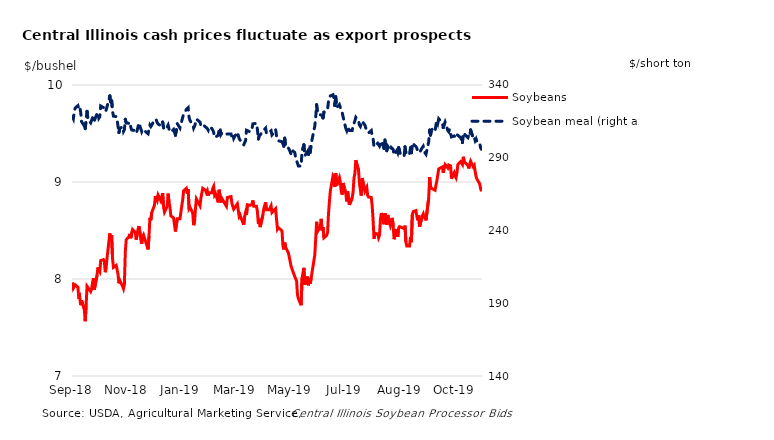
| Category | Soybeans |
|---|---|
| 2018-09-04 | 7.965 |
| 2018-09-05 | 7.905 |
| 2018-09-06 | 7.915 |
| 2018-09-07 | 7.94 |
| 2018-09-10 | 7.915 |
| 2018-09-11 | 7.795 |
| 2018-09-12 | 7.815 |
| 2018-09-13 | 7.73 |
| 2018-09-14 | 7.78 |
| 2018-09-17 | 7.69 |
| 2018-09-18 | 7.565 |
| 2018-09-19 | 7.725 |
| 2018-09-20 | 7.925 |
| 2018-09-21 | 7.93 |
| 2018-09-24 | 7.87 |
| 2018-09-25 | 7.895 |
| 2018-09-26 | 7.96 |
| 2018-09-27 | 8.01 |
| 2018-09-28 | 7.89 |
| 2018-10-01 | 8.04 |
| 2018-10-02 | 8.12 |
| 2018-10-03 | 8.09 |
| 2018-10-04 | 8.075 |
| 2018-10-05 | 8.19 |
| 2018-10-08 | 8.2 |
| 2018-10-09 | 8.18 |
| 2018-10-10 | 8.07 |
| 2018-10-11 | 8.12 |
| 2018-10-12 | 8.22 |
| 2018-10-15 | 8.47 |
| 2018-10-16 | 8.415 |
| 2018-10-17 | 8.45 |
| 2018-10-18 | 8.21 |
| 2018-10-19 | 8.12 |
| 2018-10-22 | 8.14 |
| 2018-10-23 | 8.13 |
| 2018-10-24 | 8.05 |
| 2018-10-25 | 7.955 |
| 2018-10-26 | 7.985 |
| 2018-10-29 | 7.925 |
| 2018-10-30 | 7.9 |
| 2018-10-31 | 7.945 |
| 2018-11-01 | 8.28 |
| 2018-11-02 | 8.405 |
| 2018-11-05 | 8.435 |
| 2018-11-06 | 8.465 |
| 2018-11-07 | 8.42 |
| 2018-11-08 | 8.415 |
| 2018-11-09 | 8.51 |
| 2018-11-12 | 8.48 |
| 2018-11-13 | 8.405 |
| 2018-11-14 | 8.46 |
| 2018-11-15 | 8.515 |
| 2018-11-16 | 8.545 |
| 2018-11-19 | 8.365 |
| 2018-11-20 | 8.435 |
| 2018-11-21 | 8.455 |
| 2018-11-26 | 8.305 |
| 2018-11-27 | 8.44 |
| 2018-11-28 | 8.63 |
| 2018-11-29 | 8.605 |
| 2018-11-30 | 8.685 |
| 2018-12-03 | 8.76 |
| 2018-12-04 | 8.855 |
| 2018-12-05 | 8.85 |
| 2018-12-06 | 8.81 |
| 2018-12-07 | 8.865 |
| 2018-12-10 | 8.805 |
| 2018-12-11 | 8.845 |
| 2018-12-12 | 8.885 |
| 2018-12-13 | 8.745 |
| 2018-12-14 | 8.69 |
| 2018-12-17 | 8.75 |
| 2018-12-18 | 8.88 |
| 2018-12-19 | 8.79 |
| 2018-12-20 | 8.74 |
| 2018-12-21 | 8.65 |
| 2018-12-24 | 8.63 |
| 2018-12-26 | 8.49 |
| 2018-12-27 | 8.48 |
| 2018-12-28 | 8.62 |
| 2018-12-31 | 8.62 |
| 2019-01-02 | 8.755 |
| 2019-01-03 | 8.815 |
| 2019-01-04 | 8.91 |
| 2019-01-07 | 8.935 |
| 2019-01-08 | 8.88 |
| 2019-01-09 | 8.925 |
| 2019-01-10 | 8.725 |
| 2019-01-11 | 8.74 |
| 2019-01-14 | 8.68 |
| 2019-01-15 | 8.555 |
| 2019-01-16 | 8.59 |
| 2019-01-17 | 8.725 |
| 2019-01-18 | 8.825 |
| 2019-01-22 | 8.755 |
| 2019-01-23 | 8.835 |
| 2019-01-24 | 8.845 |
| 2019-01-25 | 8.935 |
| 2019-01-28 | 8.915 |
| 2019-01-29 | 8.89 |
| 2019-01-30 | 8.91 |
| 2019-01-31 | 8.86 |
| 2019-02-01 | 8.89 |
| 2019-02-04 | 8.89 |
| 2019-02-05 | 8.935 |
| 2019-02-06 | 8.955 |
| 2019-02-07 | 8.865 |
| 2019-02-08 | 8.88 |
| 2019-02-11 | 8.79 |
| 2019-02-12 | 8.92 |
| 2019-02-13 | 8.92 |
| 2019-02-14 | 8.79 |
| 2019-02-15 | 8.83 |
| 2019-02-19 | 8.765 |
| 2019-02-20 | 8.75 |
| 2019-02-21 | 8.84 |
| 2019-02-22 | 8.83 |
| 2019-02-25 | 8.85 |
| 2019-02-26 | 8.78 |
| 2019-02-27 | 8.78 |
| 2019-02-28 | 8.72 |
| 2019-03-01 | 8.73 |
| 2019-03-04 | 8.775 |
| 2019-03-05 | 8.765 |
| 2019-03-06 | 8.645 |
| 2019-03-07 | 8.66 |
| 2019-03-08 | 8.63 |
| 2019-03-11 | 8.56 |
| 2019-03-12 | 8.645 |
| 2019-03-13 | 8.685 |
| 2019-03-14 | 8.66 |
| 2019-03-15 | 8.765 |
| 2019-03-18 | 8.76 |
| 2019-03-19 | 8.75 |
| 2019-03-20 | 8.77 |
| 2019-03-21 | 8.81 |
| 2019-03-22 | 8.75 |
| 2019-03-25 | 8.75 |
| 2019-03-26 | 8.695 |
| 2019-03-27 | 8.57 |
| 2019-03-28 | 8.59 |
| 2019-03-29 | 8.535 |
| 2019-04-01 | 8.66 |
| 2019-04-02 | 8.725 |
| 2019-04-03 | 8.715 |
| 2019-04-04 | 8.79 |
| 2019-04-05 | 8.715 |
| 2019-04-08 | 8.715 |
| 2019-04-09 | 8.725 |
| 2019-04-10 | 8.755 |
| 2019-04-11 | 8.685 |
| 2019-04-12 | 8.685 |
| 2019-04-15 | 8.725 |
| 2019-04-16 | 8.615 |
| 2019-04-17 | 8.515 |
| 2019-04-18 | 8.53 |
| 2019-04-22 | 8.495 |
| 2019-04-23 | 8.345 |
| 2019-04-24 | 8.305 |
| 2019-04-25 | 8.375 |
| 2019-04-26 | 8.325 |
| 2019-04-29 | 8.27 |
| 2019-04-30 | 8.225 |
| 2019-05-01 | 8.22 |
| 2019-05-02 | 8.13 |
| 2019-05-03 | 8.135 |
| 2019-05-06 | 8.025 |
| 2019-05-07 | 8.025 |
| 2019-05-08 | 7.98 |
| 2019-05-09 | 7.835 |
| 2019-05-10 | 7.795 |
| 2019-05-13 | 7.73 |
| 2019-05-14 | 8.01 |
| 2019-05-15 | 8.06 |
| 2019-05-16 | 8.115 |
| 2019-05-17 | 7.94 |
| 2019-05-20 | 8.025 |
| 2019-05-21 | 7.935 |
| 2019-05-22 | 8.01 |
| 2019-05-23 | 7.95 |
| 2019-05-24 | 8.01 |
| 2019-05-28 | 8.25 |
| 2019-05-29 | 8.42 |
| 2019-05-30 | 8.59 |
| 2019-05-31 | 8.49 |
| 2019-06-03 | 8.54 |
| 2019-06-04 | 8.62 |
| 2019-06-05 | 8.5 |
| 2019-06-06 | 8.535 |
| 2019-06-07 | 8.425 |
| 2019-06-10 | 8.45 |
| 2019-06-11 | 8.48 |
| 2019-06-12 | 8.67 |
| 2019-06-13 | 8.795 |
| 2019-06-14 | 8.905 |
| 2019-06-17 | 9.065 |
| 2019-06-18 | 9.05 |
| 2019-06-19 | 8.95 |
| 2019-06-20 | 9.09 |
| 2019-06-21 | 8.965 |
| 2019-06-24 | 9.045 |
| 2019-06-25 | 9 |
| 2019-06-26 | 8.905 |
| 2019-06-27 | 8.87 |
| 2019-06-28 | 8.99 |
| 2019-07-01 | 8.885 |
| 2019-07-02 | 8.8 |
| 2019-07-03 | 8.905 |
| 2019-07-05 | 8.765 |
| 2019-07-08 | 8.835 |
| 2019-07-09 | 8.895 |
| 2019-07-10 | 9.04 |
| 2019-07-11 | 9.09 |
| 2019-07-12 | 9.225 |
| 2019-07-15 | 9.12 |
| 2019-07-16 | 8.985 |
| 2019-07-17 | 8.92 |
| 2019-07-18 | 8.86 |
| 2019-07-19 | 9.04 |
| 2019-07-22 | 8.905 |
| 2019-07-23 | 8.895 |
| 2019-07-24 | 8.945 |
| 2019-07-25 | 8.86 |
| 2019-07-26 | 8.845 |
| 2019-07-29 | 8.84 |
| 2019-07-30 | 8.75 |
| 2019-07-31 | 8.6 |
| 2019-08-01 | 8.415 |
| 2019-08-02 | 8.47 |
| 2019-08-05 | 8.465 |
| 2019-08-06 | 8.425 |
| 2019-08-07 | 8.45 |
| 2019-08-08 | 8.61 |
| 2019-08-09 | 8.68 |
| 2019-08-12 | 8.565 |
| 2019-08-13 | 8.68 |
| 2019-08-14 | 8.59 |
| 2019-08-15 | 8.56 |
| 2019-08-16 | 8.66 |
| 2019-08-19 | 8.55 |
| 2019-08-20 | 8.58 |
| 2019-08-21 | 8.63 |
| 2019-08-22 | 8.55 |
| 2019-08-23 | 8.41 |
| 2019-08-26 | 8.515 |
| 2019-08-27 | 8.435 |
| 2019-08-28 | 8.525 |
| 2019-08-29 | 8.54 |
| 2019-08-30 | 8.545 |
| 2019-09-03 | 8.52 |
| 2019-09-04 | 8.55 |
| 2019-09-05 | 8.38 |
| 2019-09-06 | 8.34 |
| 2019-09-09 | 8.34 |
| 2019-09-10 | 8.435 |
| 2019-09-11 | 8.38 |
| 2019-09-12 | 8.66 |
| 2019-09-13 | 8.695 |
| 2019-09-16 | 8.705 |
| 2019-09-17 | 8.645 |
| 2019-09-18 | 8.605 |
| 2019-09-19 | 8.655 |
| 2019-09-20 | 8.54 |
| 2019-09-23 | 8.65 |
| 2019-09-24 | 8.67 |
| 2019-09-25 | 8.625 |
| 2019-09-26 | 8.66 |
| 2019-09-27 | 8.605 |
| 2019-09-30 | 8.835 |
| 2019-10-01 | 9.05 |
| 2019-10-02 | 8.955 |
| 2019-10-03 | 8.935 |
| 2019-10-04 | 8.925 |
| 2019-10-07 | 8.915 |
| 2019-10-08 | 8.97 |
| 2019-10-09 | 9.015 |
| 2019-10-10 | 9.01 |
| 2019-10-11 | 9.135 |
| 2019-10-15 | 9.155 |
| 2019-10-16 | 9.095 |
| 2019-10-17 | 9.15 |
| 2019-10-18 | 9.18 |
| 2019-10-21 | 9.145 |
| 2019-10-22 | 9.175 |
| 2019-10-23 | 9.175 |
| 2019-10-24 | 9.165 |
| 2019-10-25 | 9.035 |
| 2019-10-28 | 9.095 |
| 2019-10-29 | 9.065 |
| 2019-10-30 | 9.045 |
| 2019-10-31 | 9.095 |
| 2019-11-01 | 9.18 |
| 2019-11-04 | 9.21 |
| 2019-11-05 | 9.215 |
| 2019-11-06 | 9.18 |
| 2019-11-07 | 9.26 |
| 2019-11-08 | 9.21 |
| 2019-11-12 | 9.17 |
| 2019-11-13 | 9.14 |
| 2019-11-14 | 9.185 |
| 2019-11-15 | 9.215 |
| 2019-11-18 | 9.155 |
| 2019-11-19 | 9.17 |
| 2019-11-20 | 9.11 |
| 2019-11-21 | 9.055 |
| 2019-11-22 | 9.03 |
| 2019-11-25 | 8.98 |
| 2019-11-26 | 8.93 |
| 2019-11-27 | 8.905 |